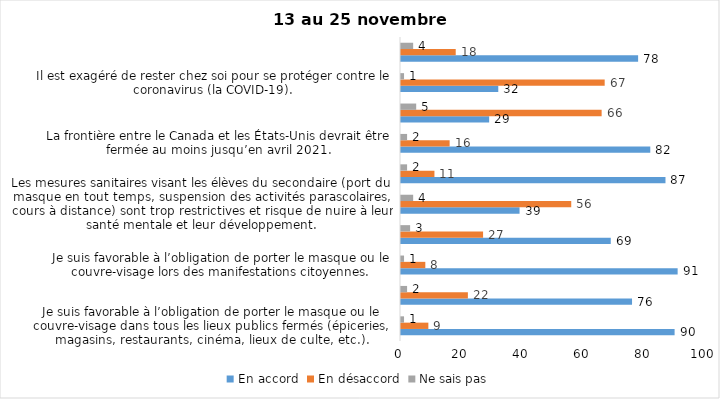
| Category | En accord | En désaccord | Ne sais pas |
|---|---|---|---|
| Je suis favorable à l’obligation de porter le masque ou le couvre-visage dans tous les lieux publics fermés (épiceries, magasins, restaurants, cinéma, lieux de culte, etc.). | 90 | 9 | 1 |
| C’est une bonne chose que les policiers puissent donner facilement des contraventions aux gens qui ne respectent pas les mesures pour prévenir le coronavirus (la COVID-19). | 76 | 22 | 2 |
| Je suis favorable à l’obligation de porter le masque ou le couvre-visage lors des manifestations citoyennes. | 91 | 8 | 1 |
| C’est une bonne chose d’arrêter les activités sportives de groupe (ex. hockey, soccer, yoga, etc.) et de fermer les centres d’entraînement (gyms) dans les zones rouges. | 69 | 27 | 3 |
| Les mesures sanitaires visant les élèves du secondaire (port du masque en tout temps, suspension des activités parascolaires, cours à distance) sont trop restrictives et risque de nuire à leur santé mentale et leur développement. | 39 | 56 | 4 |
| Je suis favorable à l’obligation de porter le masque ou le couvre-visage en tout temps pour les élèves au secondaire. | 87 | 11 | 2 |
| La frontière entre le Canada et les États-Unis devrait être fermée au moins jusqu’en avril 2021. | 82 | 16 | 2 |
| Le gouvernement et les médias exagèrent par rapport au coronavirus (la COVID-19). | 29 | 66 | 5 |
| Il est exagéré de rester chez soi pour se protéger contre le coronavirus (la COVID-19). | 32 | 67 | 1 |
| Les jeunes ne respectent pas les règles de confinement et contribuent à propager la COVID-19. | 78 | 18 | 4 |